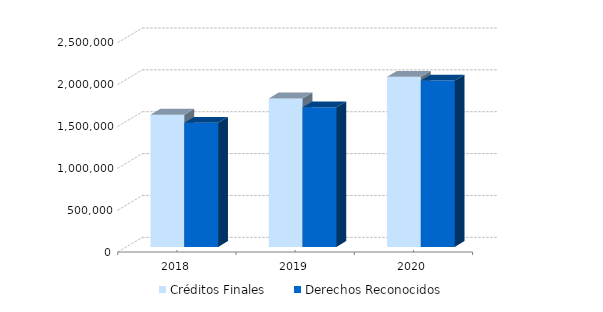
| Category | Créditos Finales | Derechos Reconocidos |
|---|---|---|
| 2018.0 | 1579757.67 | 1483015.56 |
| 2019.0 | 1774024.81 | 1668299.76 |
| 2020.0 | 2032170.41 | 1986206.58 |